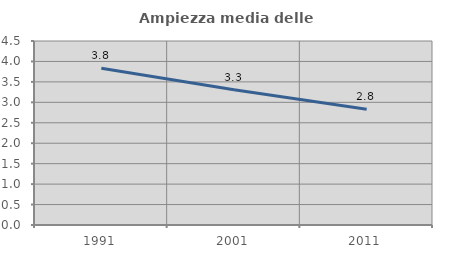
| Category | Ampiezza media delle famiglie |
|---|---|
| 1991.0 | 3.836 |
| 2001.0 | 3.306 |
| 2011.0 | 2.832 |